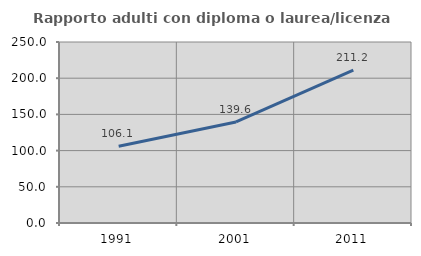
| Category | Rapporto adulti con diploma o laurea/licenza media  |
|---|---|
| 1991.0 | 106.132 |
| 2001.0 | 139.598 |
| 2011.0 | 211.178 |